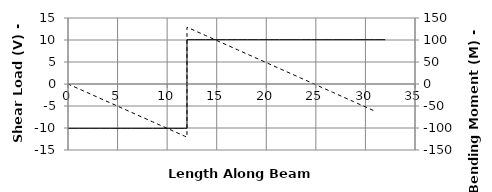
| Category | V |
|---|---|
| 0.0 | -10.071 |
| 0.0 | -10.071 |
| 0.0 | -10.071 |
| 1.0666666666666667 | -10.071 |
| 2.1333333333333333 | -10.071 |
| 3.2 | -10.071 |
| 4.266666666666667 | -10.071 |
| 5.333333333333333 | -10.071 |
| 6.4 | -10.071 |
| 7.466666666666667 | -10.071 |
| 8.533333333333333 | -10.071 |
| 9.6 | -10.071 |
| 10.666666666666666 | -10.071 |
| 11.733333333333333 | -10.071 |
| 11.99999 | -10.071 |
| 12.00001 | 10.071 |
| 12.8 | 10.071 |
| 13.866666666666667 | 10.071 |
| 14.933333333333334 | 10.071 |
| 16.0 | 10.071 |
| 17.066666666666666 | 10.071 |
| 18.133333333333333 | 10.071 |
| 19.2 | 10.071 |
| 20.266666666666666 | 10.071 |
| 21.333333333333332 | 10.071 |
| 22.4 | 10.071 |
| 23.466666666666665 | 10.071 |
| 24.53333333333333 | 10.071 |
| 25.6 | 10.071 |
| 26.666666666666668 | 10.071 |
| 27.733333333333334 | 10.071 |
| 28.8 | 10.071 |
| 29.866666666666667 | 10.071 |
| 30.933333333333334 | 10.071 |
| 32.0 | 10.071 |